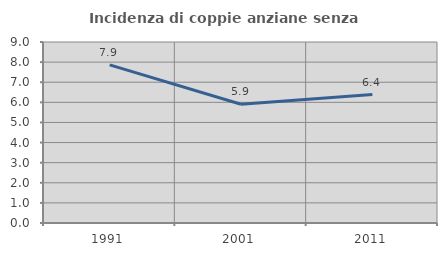
| Category | Incidenza di coppie anziane senza figli  |
|---|---|
| 1991.0 | 7.862 |
| 2001.0 | 5.902 |
| 2011.0 | 6.388 |